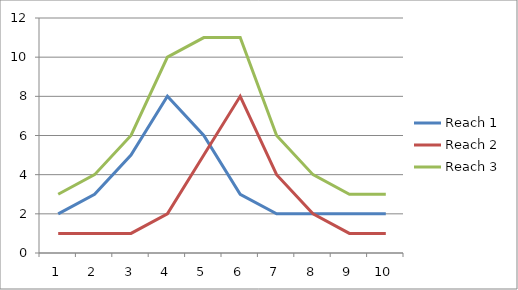
| Category | Reach 1 | Reach 2 | Reach 3 |
|---|---|---|---|
| 0 | 2 | 1 | 3 |
| 1 | 3 | 1 | 4 |
| 2 | 5 | 1 | 6 |
| 3 | 8 | 2 | 10 |
| 4 | 6 | 5 | 11 |
| 5 | 3 | 8 | 11 |
| 6 | 2 | 4 | 6 |
| 7 | 2 | 2 | 4 |
| 8 | 2 | 1 | 3 |
| 9 | 2 | 1 | 3 |